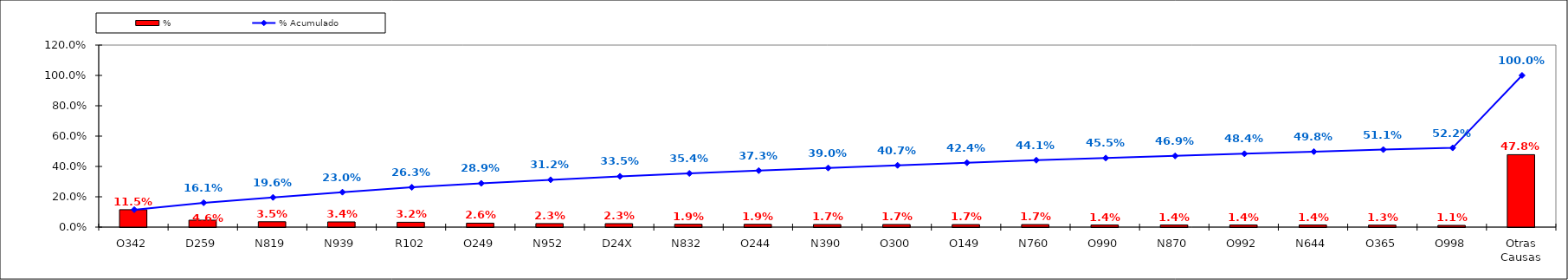
| Category | % |
|---|---|
| O342 | 0.115 |
| D259 | 0.046 |
| N819 | 0.035 |
| N939 | 0.034 |
| R102 | 0.032 |
| O249 | 0.026 |
| N952 | 0.023 |
| D24X | 0.023 |
| N832 | 0.019 |
| O244 | 0.019 |
| N390 | 0.017 |
| O300 | 0.017 |
| O149 | 0.017 |
| N760 | 0.017 |
| O990 | 0.014 |
| N870 | 0.014 |
| O992 | 0.014 |
| N644 | 0.014 |
| O365 | 0.013 |
| O998 | 0.011 |
| Otras Causas | 0.478 |